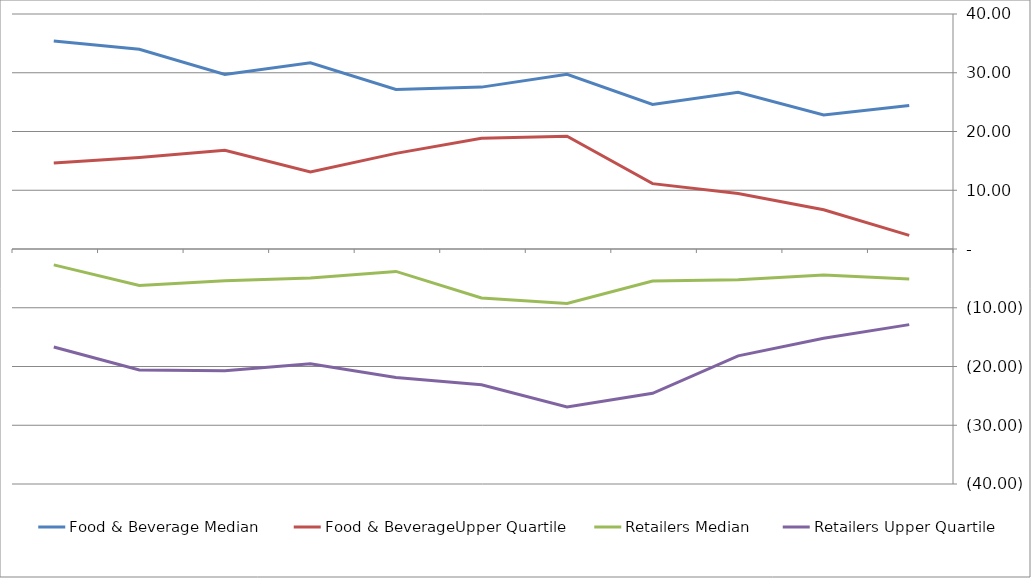
| Category | Food & Beverage Median  | Food & BeverageUpper Quartile | Retailers Median | Retailers Upper Quartile |
|---|---|---|---|---|
|  | 24.444 | 2.323 | -5.111 | -12.87 |
|  | 22.807 | 6.686 | -4.42 | -15.206 |
|  | 26.668 | 9.443 | -5.215 | -18.188 |
|  | 24.619 | 11.122 | -5.441 | -24.558 |
|  | 29.727 | 19.201 | -9.264 | -26.904 |
|  | 27.556 | 18.839 | -8.343 | -23.112 |
|  | 27.142 | 16.276 | -3.818 | -21.858 |
|  | 31.697 | 13.109 | -4.925 | -19.515 |
|  | 29.694 | 16.795 | -5.425 | -20.712 |
|  | 34.01 | 15.577 | -6.204 | -20.601 |
|  | 35.413 | 14.64 | -2.708 | -16.68 |